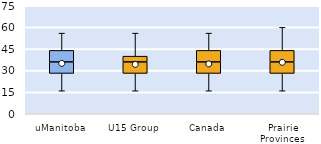
| Category | 25th | 50th | 75th |
|---|---|---|---|
| uManitoba | 28 | 8 | 8 |
| U15 Group | 28 | 8 | 4 |
| Canada | 28 | 8 | 8 |
| Prairie Provinces | 28 | 8 | 8 |